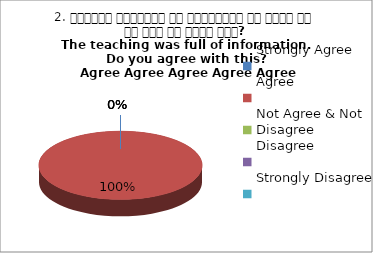
| Category | 2. शिक्षण जानकारी से परिपूर्ण था क्या आप इस बात से सहमत हैं?
The teaching was full of information. Do you agree with this?
 Agree Agree Agree Agree Agree |
|---|---|
| Strongly Agree | 0 |
| Agree | 4 |
| Not Agree & Not Disagree | 0 |
| Disagree | 0 |
| Strongly Disagree | 0 |